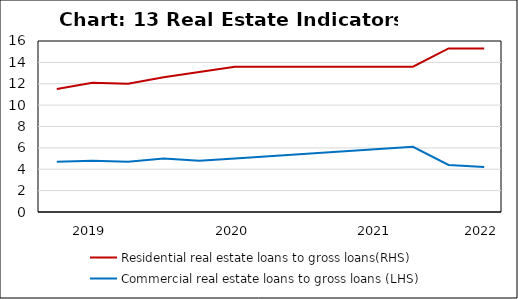
| Category | Residential real estate loans to gross loans(RHS) | Commercial real estate loans to gross loans (LHS) |
|---|---|---|
| nan | 11.5 | 4.7 |
| 2019.0 | 12.1 | 4.8 |
| nan | 12 | 4.7 |
| nan | 12.6 | 5 |
| nan | 13.1 | 4.8 |
| 2020.0 | 13.6 | 5 |
| nan | 0 | 0 |
| nan | 0 | 0 |
| nan | 0 | 0 |
| 2021.0 | 0 | 0 |
| nan | 13.6 | 6.1 |
| nan | 15.3 | 4.4 |
| 2022.0 | 15.3 | 4.2 |